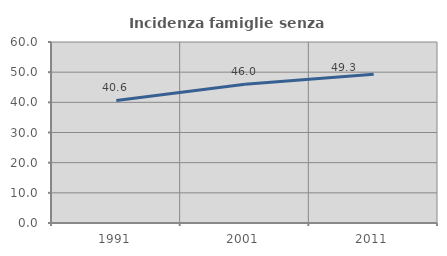
| Category | Incidenza famiglie senza nuclei |
|---|---|
| 1991.0 | 40.625 |
| 2001.0 | 46 |
| 2011.0 | 49.315 |